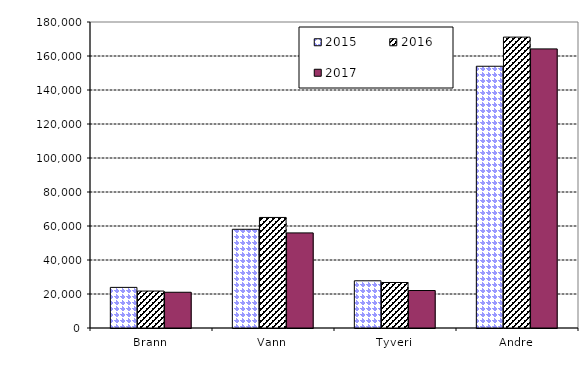
| Category | 2015 | 2016 | 2017 |
|---|---|---|---|
| Brann | 23890.575 | 21734.71 | 21023.774 |
| Vann | 58062.925 | 65032.459 | 55945.461 |
| Tyveri | 27772.958 | 26773.593 | 22043.333 |
| Andre | 153966.821 | 171109.097 | 164178.012 |